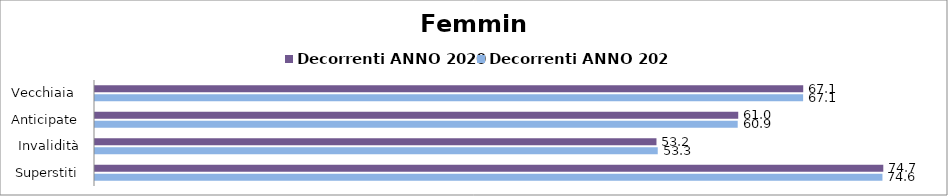
| Category | Decorrenti ANNO 2020 | Decorrenti ANNO 2021 |
|---|---|---|
| Vecchiaia  | 67.13 | 67.12 |
| Anticipate | 60.97 | 60.92 |
| Invalidità | 53.22 | 53.34 |
| Superstiti | 74.72 | 74.64 |